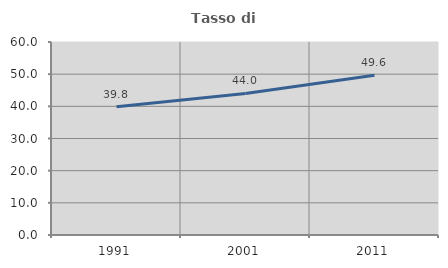
| Category | Tasso di occupazione   |
|---|---|
| 1991.0 | 39.84 |
| 2001.0 | 43.998 |
| 2011.0 | 49.636 |